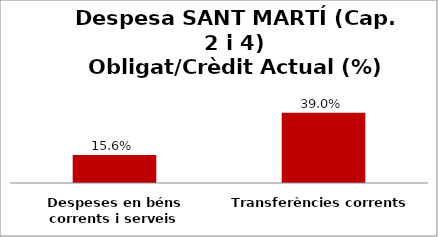
| Category | Series 0 |
|---|---|
| Despeses en béns corrents i serveis | 0.156 |
| Transferències corrents | 0.39 |